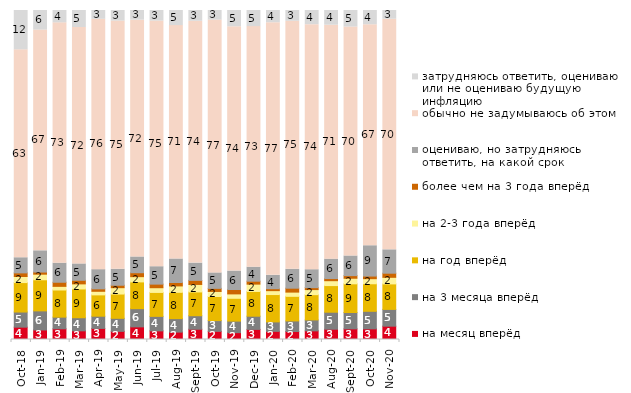
| Category | на месяц вперёд | на 3 месяца вперёд | на год вперёд | на 2-3 года вперёд | более чем на 3 года вперёд | оцениваю, но затрудняюсь ответить, на какой срок | обычно не задумываюсь об этом | затрудняюсь ответить, оцениваю или не оцениваю будущую инфляцию |
|---|---|---|---|---|---|---|---|---|
| 2018-10-01 | 3.75 | 4.6 | 8.95 | 1.85 | 1.1 | 4.6 | 63.2 | 11.95 |
| 2019-01-01 | 2.9 | 5.8 | 9.45 | 1.7 | 0.65 | 6.45 | 67.1 | 5.95 |
| 2019-02-01 | 3.25 | 3.55 | 8.25 | 1.1 | 1.25 | 5.8 | 73.05 | 3.75 |
| 2019-03-01 | 2.636 | 3.978 | 8.752 | 1.542 | 1.094 | 4.973 | 71.855 | 5.172 |
| 2019-04-01 | 3.366 | 3.713 | 6.485 | 1.089 | 0.743 | 5.842 | 76.089 | 2.673 |
| 2019-05-01 | 2.476 | 3.962 | 7.38 | 1.932 | 0.743 | 4.854 | 75.433 | 3.219 |
| 2019-06-01 | 3.84 | 5.536 | 8.13 | 1.596 | 1.197 | 4.788 | 71.97 | 2.943 |
| 2019-07-01 | 2.624 | 4.406 | 7.277 | 1.436 | 1.089 | 5.297 | 74.653 | 3.218 |
| 2019-08-01 | 2.248 | 4.096 | 7.992 | 1.948 | 1.049 | 7.143 | 70.929 | 4.595 |
| 2019-09-01 | 3.119 | 4.109 | 7.228 | 2.277 | 1.238 | 5.248 | 73.515 | 3.267 |
| 2019-10-01 | 2.475 | 3.267 | 7.327 | 1.535 | 0.941 | 4.703 | 76.832 | 2.921 |
| 2019-11-01 | 2.079 | 3.515 | 6.931 | 1.337 | 1.337 | 5.594 | 74.257 | 4.95 |
| 2019-12-01 | 3.069 | 4.01 | 7.525 | 2.228 | 0.891 | 4.257 | 73.119 | 4.901 |
| 2020-01-01 | 2.475 | 2.871 | 8.317 | 1.188 | 0.594 | 4.059 | 76.782 | 3.713 |
| 2020-02-01 | 2.426 | 3.218 | 7.475 | 1.287 | 1.188 | 5.743 | 75.396 | 3.267 |
| 2020-03-01 | 2.628 | 3.322 | 7.685 | 1.537 | 0.595 | 5.454 | 74.467 | 4.313 |
| 2020-08-01 | 3.128 | 5.164 | 8.093 | 1.49 | 0.645 | 5.909 | 71.102 | 4.469 |
| 2020-09-01 | 3.235 | 4.978 | 8.711 | 1.692 | 0.796 | 5.973 | 69.587 | 5.027 |
| 2020-10-01 | 3.239 | 5.331 | 8.371 | 1.545 | 0.797 | 9.218 | 67.165 | 4.335 |
| 2020-11-01 | 4.05 | 5.1 | 7.75 | 2 | 1.25 | 7.1 | 70.1 | 2.65 |